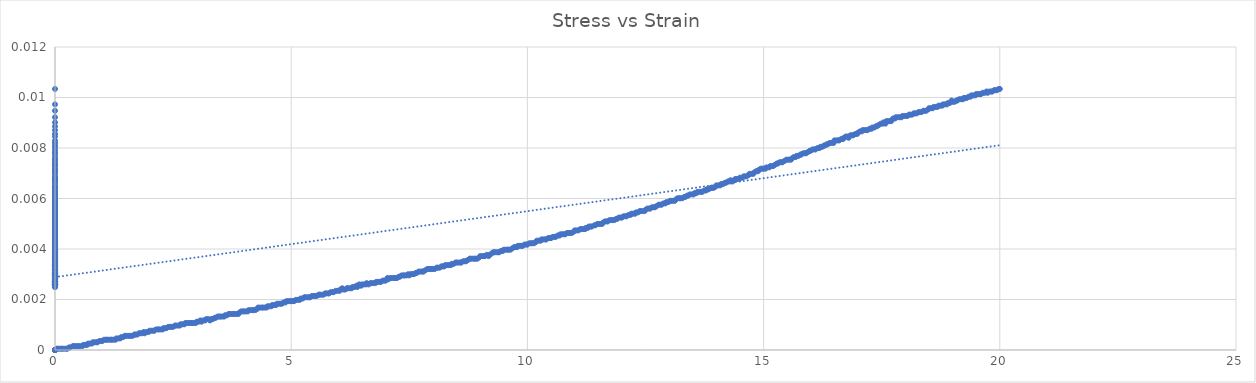
| Category | Series 0 |
|---|---|
| 0.0 | 0 |
| 0.0 | 0 |
| 0.0 | 0 |
| 0.0 | 0 |
| 0.0 | 0 |
| 0.0 | 0 |
| 0.0 | 0 |
| 0.0 | 0 |
| 0.0 | 0 |
| 0.0 | 0 |
| 0.0 | 0 |
| 0.0 | 0 |
| 0.0 | 0 |
| 0.04 | 0 |
| 0.060000000000000005 | 0 |
| 0.1 | 0 |
| 0.13999999999999999 | 0 |
| 0.16 | 0 |
| 0.2 | 0 |
| 0.24000000000000002 | 0 |
| 0.26 | 0 |
| 0.3 | 0 |
| 0.32 | 0 |
| 0.38 | 0 |
| 0.4 | 0 |
| 0.43999999999999995 | 0 |
| 0.48000000000000004 | 0 |
| 0.5 | 0 |
| 0.54 | 0 |
| 0.5800000000000001 | 0 |
| 0.6 | 0 |
| 0.64 | 0 |
| 0.68 | 0 |
| 0.7000000000000001 | 0 |
| 0.74 | 0 |
| 0.7799999999999999 | 0 |
| 0.8 | 0 |
| 0.8400000000000001 | 0 |
| 0.8799999999999999 | 0 |
| 0.8999999999999999 | 0 |
| 0.9400000000000001 | 0 |
| 0.98 | 0 |
| 1.0 | 0 |
| 1.04 | 0 |
| 1.08 | 0 |
| 1.0999999999999999 | 0 |
| 1.1400000000000001 | 0 |
| 1.18 | 0 |
| 1.2 | 0 |
| 1.24 | 0 |
| 1.28 | 0 |
| 1.3 | 0 |
| 1.34 | 0 |
| 1.3800000000000001 | 0 |
| 1.4000000000000001 | 0.001 |
| 1.44 | 0.001 |
| 1.48 | 0.001 |
| 1.5 | 0.001 |
| 1.54 | 0.001 |
| 1.58 | 0.001 |
| 1.6 | 0.001 |
| 1.6400000000000001 | 0.001 |
| 1.6800000000000002 | 0.001 |
| 1.7000000000000002 | 0.001 |
| 1.7399999999999998 | 0.001 |
| 1.78 | 0.001 |
| 1.7999999999999998 | 0.001 |
| 1.8399999999999999 | 0.001 |
| 1.8800000000000001 | 0.001 |
| 1.9 | 0.001 |
| 1.94 | 0.001 |
| 1.9800000000000002 | 0.001 |
| 2.0 | 0.001 |
| 2.0399999999999996 | 0.001 |
| 2.08 | 0.001 |
| 2.0999999999999996 | 0.001 |
| 2.1399999999999997 | 0.001 |
| 2.18 | 0.001 |
| 2.1999999999999997 | 0.001 |
| 2.2399999999999998 | 0.001 |
| 2.2800000000000002 | 0.001 |
| 2.3 | 0.001 |
| 2.34 | 0.001 |
| 2.36 | 0.001 |
| 2.4 | 0.001 |
| 2.44 | 0.001 |
| 2.46 | 0.001 |
| 2.5 | 0.001 |
| 2.54 | 0.001 |
| 2.56 | 0.001 |
| 2.6 | 0.001 |
| 2.64 | 0.001 |
| 2.66 | 0.001 |
| 2.7 | 0.001 |
| 2.74 | 0.001 |
| 2.7600000000000002 | 0.001 |
| 2.8000000000000003 | 0.001 |
| 2.84 | 0.001 |
| 2.88 | 0.001 |
| 2.9 | 0.001 |
| 2.94 | 0.001 |
| 2.98 | 0.001 |
| 3.0 | 0.001 |
| 3.04 | 0.001 |
| 3.08 | 0.001 |
| 3.1 | 0.001 |
| 3.1399999999999997 | 0.001 |
| 3.18 | 0.001 |
| 3.2 | 0.001 |
| 3.2399999999999998 | 0.001 |
| 3.2800000000000002 | 0.001 |
| 3.3000000000000003 | 0.001 |
| 3.34 | 0.001 |
| 3.3800000000000003 | 0.001 |
| 3.4000000000000004 | 0.001 |
| 3.44 | 0.001 |
| 3.4799999999999995 | 0.001 |
| 3.4999999999999996 | 0.001 |
| 3.54 | 0.001 |
| 3.58 | 0.001 |
| 3.5999999999999996 | 0.001 |
| 3.64 | 0.001 |
| 3.6799999999999997 | 0.001 |
| 3.6999999999999997 | 0.001 |
| 3.74 | 0.001 |
| 3.7800000000000002 | 0.001 |
| 3.8 | 0.001 |
| 3.8400000000000003 | 0.001 |
| 3.88 | 0.001 |
| 3.9 | 0.001 |
| 3.9400000000000004 | 0.002 |
| 3.9800000000000004 | 0.002 |
| 4.0 | 0.002 |
| 4.040000000000001 | 0.002 |
| 4.079999999999999 | 0.002 |
| 4.1 | 0.002 |
| 4.14 | 0.002 |
| 4.18 | 0.002 |
| 4.199999999999999 | 0.002 |
| 4.24 | 0.002 |
| 4.279999999999999 | 0.002 |
| 4.3 | 0.002 |
| 4.34 | 0.002 |
| 4.38 | 0.002 |
| 4.3999999999999995 | 0.002 |
| 4.44 | 0.002 |
| 4.4799999999999995 | 0.002 |
| 4.5 | 0.002 |
| 4.54 | 0.002 |
| 4.58 | 0.002 |
| 4.6 | 0.002 |
| 4.640000000000001 | 0.002 |
| 4.68 | 0.002 |
| 4.7 | 0.002 |
| 4.74 | 0.002 |
| 4.779999999999999 | 0.002 |
| 4.8 | 0.002 |
| 4.84 | 0.002 |
| 4.88 | 0.002 |
| 4.9 | 0.002 |
| 4.9399999999999995 | 0.002 |
| 4.9799999999999995 | 0.002 |
| 5.0 | 0.002 |
| 5.04 | 0.002 |
| 5.06 | 0.002 |
| 5.1000000000000005 | 0.002 |
| 5.140000000000001 | 0.002 |
| 5.18 | 0.002 |
| 5.2 | 0.002 |
| 5.24 | 0.002 |
| 5.28 | 0.002 |
| 5.300000000000001 | 0.002 |
| 5.34 | 0.002 |
| 5.38 | 0.002 |
| 5.4 | 0.002 |
| 5.44 | 0.002 |
| 5.48 | 0.002 |
| 5.500000000000001 | 0.002 |
| 5.540000000000001 | 0.002 |
| 5.58 | 0.002 |
| 5.6000000000000005 | 0.002 |
| 5.639999999999999 | 0.002 |
| 5.68 | 0.002 |
| 5.72 | 0.002 |
| 5.739999999999999 | 0.002 |
| 5.779999999999999 | 0.002 |
| 5.8 | 0.002 |
| 5.839999999999999 | 0.002 |
| 5.88 | 0.002 |
| 5.8999999999999995 | 0.002 |
| 5.9399999999999995 | 0.002 |
| 5.9799999999999995 | 0.002 |
| 6.02 | 0.002 |
| 6.039999999999999 | 0.002 |
| 6.08 | 0.002 |
| 6.1 | 0.002 |
| 6.14 | 0.002 |
| 6.18 | 0.002 |
| 6.2 | 0.002 |
| 6.239999999999999 | 0.002 |
| 6.279999999999999 | 0.002 |
| 6.3 | 0.002 |
| 6.34 | 0.002 |
| 6.38 | 0.003 |
| 6.4 | 0.002 |
| 6.4399999999999995 | 0.003 |
| 6.4799999999999995 | 0.003 |
| 6.5 | 0.003 |
| 6.54 | 0.003 |
| 6.58 | 0.003 |
| 6.6000000000000005 | 0.003 |
| 6.64 | 0.003 |
| 6.68 | 0.003 |
| 6.7 | 0.003 |
| 6.74 | 0.003 |
| 6.78 | 0.003 |
| 6.800000000000001 | 0.003 |
| 6.84 | 0.003 |
| 6.88 | 0.003 |
| 6.8999999999999995 | 0.003 |
| 6.939999999999999 | 0.003 |
| 6.98 | 0.003 |
| 6.999999999999999 | 0.003 |
| 7.039999999999999 | 0.003 |
| 7.06 | 0.003 |
| 7.1 | 0.003 |
| 7.139999999999999 | 0.003 |
| 7.180000000000001 | 0.003 |
| 7.199999999999999 | 0.003 |
| 7.239999999999999 | 0.003 |
| 7.28 | 0.003 |
| 7.3 | 0.003 |
| 7.339999999999999 | 0.003 |
| 7.380000000000001 | 0.003 |
| 7.3999999999999995 | 0.003 |
| 7.4399999999999995 | 0.003 |
| 7.48 | 0.003 |
| 7.5 | 0.003 |
| 7.539999999999999 | 0.003 |
| 7.5600000000000005 | 0.003 |
| 7.6 | 0.003 |
| 7.64 | 0.003 |
| 7.66 | 0.003 |
| 7.7 | 0.003 |
| 7.739999999999999 | 0.003 |
| 7.780000000000001 | 0.003 |
| 7.8 | 0.003 |
| 7.84 | 0.003 |
| 7.880000000000001 | 0.003 |
| 7.920000000000001 | 0.003 |
| 7.9399999999999995 | 0.003 |
| 7.980000000000001 | 0.003 |
| 8.0 | 0.003 |
| 8.04 | 0.003 |
| 8.080000000000002 | 0.003 |
| 8.1 | 0.003 |
| 8.14 | 0.003 |
| 8.18 | 0.003 |
| 8.2 | 0.003 |
| 8.24 | 0.003 |
| 8.26 | 0.003 |
| 8.299999999999999 | 0.003 |
| 8.34 | 0.003 |
| 8.38 | 0.003 |
| 8.399999999999999 | 0.003 |
| 8.44 | 0.003 |
| 8.48 | 0.003 |
| 8.5 | 0.003 |
| 8.540000000000001 | 0.003 |
| 8.58 | 0.003 |
| 8.6 | 0.003 |
| 8.64 | 0.004 |
| 8.68 | 0.004 |
| 8.7 | 0.004 |
| 8.74 | 0.004 |
| 8.780000000000001 | 0.004 |
| 8.799999999999999 | 0.004 |
| 8.84 | 0.004 |
| 8.88 | 0.004 |
| 8.9 | 0.004 |
| 8.940000000000001 | 0.004 |
| 8.98 | 0.004 |
| 9.0 | 0.004 |
| 9.040000000000001 | 0.004 |
| 9.08 | 0.004 |
| 9.1 | 0.004 |
| 9.14 | 0.004 |
| 9.180000000000001 | 0.004 |
| 9.2 | 0.004 |
| 9.24 | 0.004 |
| 9.280000000000001 | 0.004 |
| 9.3 | 0.004 |
| 9.340000000000002 | 0.004 |
| 9.379999999999999 | 0.004 |
| 9.4 | 0.004 |
| 9.44 | 0.004 |
| 9.48 | 0.004 |
| 9.5 | 0.004 |
| 9.54 | 0.004 |
| 9.58 | 0.004 |
| 9.6 | 0.004 |
| 9.64 | 0.004 |
| 9.68 | 0.004 |
| 9.719999999999999 | 0.004 |
| 9.74 | 0.004 |
| 9.78 | 0.004 |
| 9.8 | 0.004 |
| 9.84 | 0.004 |
| 9.879999999999999 | 0.004 |
| 9.9 | 0.004 |
| 9.94 | 0.004 |
| 9.98 | 0.004 |
| 10.0 | 0.004 |
| 10.040000000000001 | 0.004 |
| 10.08 | 0.004 |
| 10.100000000000001 | 0.004 |
| 10.14 | 0.004 |
| 10.18 | 0.004 |
| 10.200000000000001 | 0.004 |
| 10.24 | 0.004 |
| 10.280000000000001 | 0.004 |
| 10.3 | 0.004 |
| 10.34 | 0.004 |
| 10.38 | 0.004 |
| 10.4 | 0.004 |
| 10.440000000000001 | 0.004 |
| 10.48 | 0.004 |
| 10.500000000000002 | 0.004 |
| 10.540000000000001 | 0.004 |
| 10.58 | 0.004 |
| 10.600000000000001 | 0.004 |
| 10.64 | 0.005 |
| 10.68 | 0.005 |
| 10.700000000000001 | 0.005 |
| 10.74 | 0.005 |
| 10.780000000000001 | 0.005 |
| 10.8 | 0.005 |
| 10.840000000000002 | 0.005 |
| 10.88 | 0.005 |
| 10.900000000000002 | 0.005 |
| 10.940000000000001 | 0.005 |
| 10.98 | 0.005 |
| 11.000000000000002 | 0.005 |
| 11.040000000000001 | 0.005 |
| 11.080000000000002 | 0.005 |
| 11.120000000000001 | 0.005 |
| 11.14 | 0.005 |
| 11.180000000000001 | 0.005 |
| 11.22 | 0.005 |
| 11.240000000000002 | 0.005 |
| 11.279999999999998 | 0.005 |
| 11.299999999999999 | 0.005 |
| 11.339999999999998 | 0.005 |
| 11.36 | 0.005 |
| 11.42 | 0.005 |
| 11.44 | 0.005 |
| 11.479999999999999 | 0.005 |
| 11.5 | 0.005 |
| 11.54 | 0.005 |
| 11.579999999999998 | 0.005 |
| 11.6 | 0.005 |
| 11.639999999999999 | 0.005 |
| 11.679999999999998 | 0.005 |
| 11.7 | 0.005 |
| 11.739999999999998 | 0.005 |
| 11.78 | 0.005 |
| 11.799999999999999 | 0.005 |
| 11.84 | 0.005 |
| 11.879999999999999 | 0.005 |
| 11.899999999999999 | 0.005 |
| 11.94 | 0.005 |
| 11.979999999999999 | 0.005 |
| 12.0 | 0.005 |
| 12.04 | 0.005 |
| 12.079999999999998 | 0.005 |
| 12.1 | 0.005 |
| 12.139999999999999 | 0.005 |
| 12.18 | 0.005 |
| 12.2 | 0.005 |
| 12.24 | 0.005 |
| 12.28 | 0.005 |
| 12.3 | 0.005 |
| 12.34 | 0.005 |
| 12.379999999999999 | 0.006 |
| 12.4 | 0.006 |
| 12.44 | 0.006 |
| 12.479999999999999 | 0.006 |
| 12.5 | 0.006 |
| 12.540000000000001 | 0.006 |
| 12.58 | 0.006 |
| 12.6 | 0.006 |
| 12.64 | 0.006 |
| 12.68 | 0.006 |
| 12.7 | 0.006 |
| 12.740000000000002 | 0.006 |
| 12.78 | 0.006 |
| 12.82 | 0.006 |
| 12.840000000000002 | 0.006 |
| 12.879999999999999 | 0.006 |
| 12.920000000000002 | 0.006 |
| 12.940000000000001 | 0.006 |
| 12.98 | 0.006 |
| 13.020000000000001 | 0.006 |
| 13.040000000000001 | 0.006 |
| 13.08 | 0.006 |
| 13.120000000000001 | 0.006 |
| 13.140000000000002 | 0.006 |
| 13.18 | 0.006 |
| 13.22 | 0.006 |
| 13.240000000000002 | 0.006 |
| 13.28 | 0.006 |
| 13.320000000000002 | 0.006 |
| 13.340000000000002 | 0.006 |
| 13.38 | 0.006 |
| 13.4 | 0.006 |
| 13.440000000000001 | 0.006 |
| 13.48 | 0.006 |
| 13.520000000000001 | 0.006 |
| 13.540000000000003 | 0.006 |
| 13.58 | 0.006 |
| 13.600000000000001 | 0.006 |
| 13.640000000000002 | 0.006 |
| 13.68 | 0.006 |
| 13.700000000000001 | 0.006 |
| 13.740000000000002 | 0.006 |
| 13.779999999999998 | 0.006 |
| 13.799999999999999 | 0.006 |
| 13.84 | 0.006 |
| 13.879999999999997 | 0.006 |
| 13.899999999999999 | 0.006 |
| 13.94 | 0.006 |
| 13.979999999999999 | 0.006 |
| 13.999999999999998 | 0.007 |
| 14.04 | 0.007 |
| 14.079999999999998 | 0.007 |
| 14.099999999999998 | 0.007 |
| 14.14 | 0.007 |
| 14.179999999999998 | 0.007 |
| 14.2 | 0.007 |
| 14.24 | 0.007 |
| 14.279999999999998 | 0.007 |
| 14.299999999999999 | 0.007 |
| 14.34 | 0.007 |
| 14.379999999999999 | 0.007 |
| 14.399999999999999 | 0.007 |
| 14.44 | 0.007 |
| 14.479999999999999 | 0.007 |
| 14.499999999999998 | 0.007 |
| 14.540000000000001 | 0.007 |
| 14.579999999999998 | 0.007 |
| 14.6 | 0.007 |
| 14.64 | 0.007 |
| 14.679999999999998 | 0.007 |
| 14.7 | 0.007 |
| 14.74 | 0.007 |
| 14.78 | 0.007 |
| 14.799999999999999 | 0.007 |
| 14.84 | 0.007 |
| 14.879999999999999 | 0.007 |
| 14.899999999999999 | 0.007 |
| 14.940000000000001 | 0.007 |
| 14.979999999999999 | 0.007 |
| 15.0 | 0.007 |
| 15.040000000000001 | 0.007 |
| 15.06 | 0.007 |
| 15.120000000000001 | 0.007 |
| 15.14 | 0.007 |
| 15.18 | 0.007 |
| 15.2 | 0.007 |
| 15.24 | 0.007 |
| 15.28 | 0.007 |
| 15.299999999999999 | 0.007 |
| 15.340000000000002 | 0.007 |
| 15.379999999999999 | 0.007 |
| 15.4 | 0.007 |
| 15.440000000000001 | 0.007 |
| 15.479999999999999 | 0.008 |
| 15.52 | 0.008 |
| 15.540000000000001 | 0.008 |
| 15.58 | 0.008 |
| 15.6 | 0.008 |
| 15.64 | 0.008 |
| 15.68 | 0.008 |
| 15.7 | 0.008 |
| 15.740000000000002 | 0.008 |
| 15.78 | 0.008 |
| 15.8 | 0.008 |
| 15.840000000000002 | 0.008 |
| 15.879999999999999 | 0.008 |
| 15.9 | 0.008 |
| 15.940000000000001 | 0.008 |
| 15.98 | 0.008 |
| 16.0 | 0.008 |
| 16.040000000000003 | 0.008 |
| 16.08 | 0.008 |
| 16.1 | 0.008 |
| 16.14 | 0.008 |
| 16.18 | 0.008 |
| 16.2 | 0.008 |
| 16.240000000000002 | 0.008 |
| 16.28 | 0.008 |
| 16.299999999999997 | 0.008 |
| 16.34 | 0.008 |
| 16.36 | 0.008 |
| 16.4 | 0.008 |
| 16.439999999999998 | 0.008 |
| 16.48 | 0.008 |
| 16.499999999999996 | 0.008 |
| 16.54 | 0.008 |
| 16.580000000000002 | 0.008 |
| 16.599999999999998 | 0.008 |
| 16.64 | 0.008 |
| 16.68 | 0.008 |
| 16.7 | 0.008 |
| 16.74 | 0.008 |
| 16.78 | 0.008 |
| 16.799999999999997 | 0.008 |
| 16.84 | 0.009 |
| 16.88 | 0.009 |
| 16.9 | 0.009 |
| 16.939999999999998 | 0.009 |
| 16.98 | 0.009 |
| 17.0 | 0.009 |
| 17.04 | 0.009 |
| 17.080000000000002 | 0.009 |
| 17.099999999999998 | 0.009 |
| 17.14 | 0.009 |
| 17.18 | 0.009 |
| 17.2 | 0.009 |
| 17.24 | 0.009 |
| 17.28 | 0.009 |
| 17.299999999999997 | 0.009 |
| 17.34 | 0.009 |
| 17.380000000000003 | 0.009 |
| 17.4 | 0.009 |
| 17.44 | 0.009 |
| 17.48 | 0.009 |
| 17.52 | 0.009 |
| 17.54 | 0.009 |
| 17.580000000000002 | 0.009 |
| 17.599999999999998 | 0.009 |
| 17.64 | 0.009 |
| 17.68 | 0.009 |
| 17.7 | 0.009 |
| 17.740000000000002 | 0.009 |
| 17.78 | 0.009 |
| 17.8 | 0.009 |
| 17.84 | 0.009 |
| 17.880000000000003 | 0.009 |
| 17.919999999999998 | 0.009 |
| 17.94 | 0.009 |
| 17.98 | 0.009 |
| 18.02 | 0.009 |
| 18.04 | 0.009 |
| 18.080000000000002 | 0.009 |
| 18.099999999999998 | 0.009 |
| 18.14 | 0.009 |
| 18.180000000000003 | 0.009 |
| 18.2 | 0.009 |
| 18.240000000000002 | 0.009 |
| 18.28 | 0.009 |
| 18.3 | 0.009 |
| 18.34 | 0.009 |
| 18.380000000000003 | 0.009 |
| 18.4 | 0.009 |
| 18.44 | 0.009 |
| 18.48 | 0.01 |
| 18.5 | 0.01 |
| 18.54 | 0.01 |
| 18.580000000000002 | 0.01 |
| 18.6 | 0.01 |
| 18.64 | 0.01 |
| 18.680000000000003 | 0.01 |
| 18.7 | 0.01 |
| 18.740000000000002 | 0.01 |
| 18.78 | 0.01 |
| 18.8 | 0.01 |
| 18.84 | 0.01 |
| 18.88 | 0.01 |
| 18.9 | 0.01 |
| 18.939999999999998 | 0.01 |
| 18.98 | 0.01 |
| 19.0 | 0.01 |
| 19.04 | 0.01 |
| 19.08 | 0.01 |
| 19.1 | 0.01 |
| 19.139999999999997 | 0.01 |
| 19.18 | 0.01 |
| 19.22 | 0.01 |
| 19.24 | 0.01 |
| 19.28 | 0.01 |
| 19.3 | 0.01 |
| 19.34 | 0.01 |
| 19.38 | 0.01 |
| 19.400000000000002 | 0.01 |
| 19.439999999999998 | 0.01 |
| 19.48 | 0.01 |
| 19.5 | 0.01 |
| 19.54 | 0.01 |
| 19.580000000000002 | 0.01 |
| 19.6 | 0.01 |
| 19.64 | 0.01 |
| 19.68 | 0.01 |
| 19.72 | 0.01 |
| 19.74 | 0.01 |
| 19.78 | 0.01 |
| 19.82 | 0.01 |
| 19.84 | 0.01 |
| 19.88 | 0.01 |
| 19.900000000000002 | 0.01 |
| 19.939999999999998 | 0.01 |
| 19.98 | 0.01 |
| 20.0 | 0.01 |